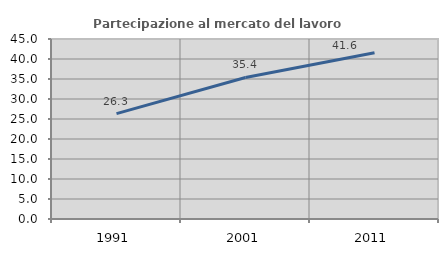
| Category | Partecipazione al mercato del lavoro  femminile |
|---|---|
| 1991.0 | 26.344 |
| 2001.0 | 35.375 |
| 2011.0 | 41.568 |